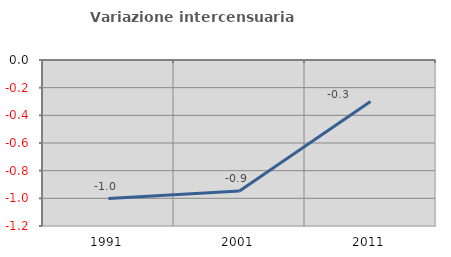
| Category | Variazione intercensuaria annua |
|---|---|
| 1991.0 | -1.001 |
| 2001.0 | -0.947 |
| 2011.0 | -0.3 |